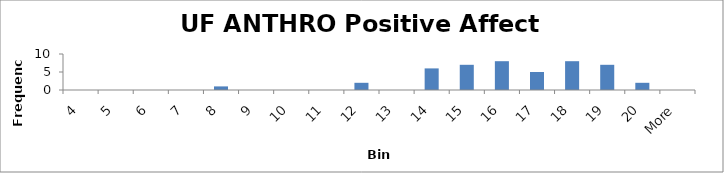
| Category | Frequency |
|---|---|
| 4 | 0 |
| 5 | 0 |
| 6 | 0 |
| 7 | 0 |
| 8 | 1 |
| 9 | 0 |
| 10 | 0 |
| 11 | 0 |
| 12 | 2 |
| 13 | 0 |
| 14 | 6 |
| 15 | 7 |
| 16 | 8 |
| 17 | 5 |
| 18 | 8 |
| 19 | 7 |
| 20 | 2 |
| More | 0 |